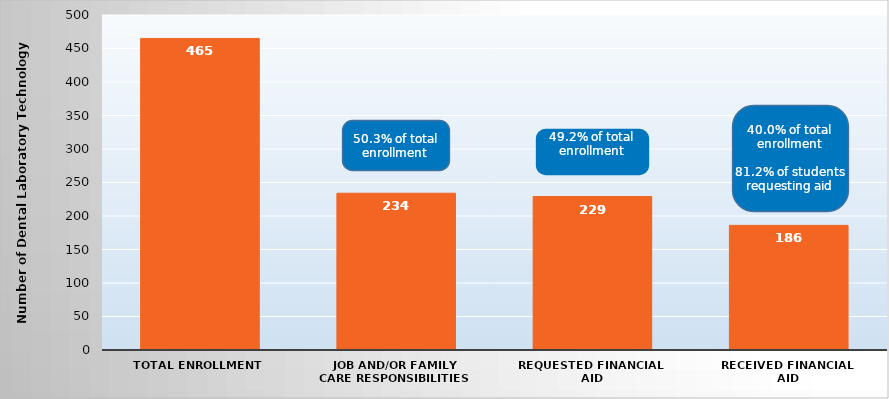
| Category | Series 0 |
|---|---|
| Total Enrollment | 465 |
| Job and/or Family Care Responsibilities | 234 |
| Requested Financial Aid | 229 |
| Received Financial Aid | 186 |